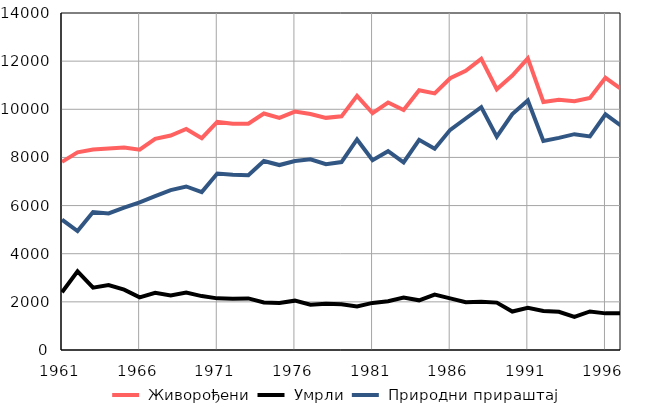
| Category |  Живорођени |  Умрли |  Природни прираштај |
|---|---|---|---|
| 1961.0 | 7814 | 2400 | 5414 |
| 1962.0 | 8210 | 3269 | 4941 |
| 1963.0 | 8325 | 2591 | 5734 |
| 1964.0 | 8373 | 2701 | 5672 |
| 1965.0 | 8415 | 2505 | 5910 |
| 1966.0 | 8323 | 2189 | 6134 |
| 1967.0 | 8773 | 2378 | 6395 |
| 1968.0 | 8910 | 2266 | 6644 |
| 1969.0 | 9180 | 2387 | 6793 |
| 1970.0 | 8798 | 2240 | 6558 |
| 1971.0 | 9475 | 2145 | 7330 |
| 1972.0 | 9403 | 2126 | 7277 |
| 1973.0 | 9403 | 2142 | 7261 |
| 1974.0 | 9825 | 1974 | 7851 |
| 1975.0 | 9639 | 1956 | 7683 |
| 1976.0 | 9902 | 2050 | 7852 |
| 1977.0 | 9804 | 1880 | 7924 |
| 1978.0 | 9644 | 1923 | 7721 |
| 1979.0 | 9707 | 1899 | 7808 |
| 1980.0 | 10556 | 1809 | 8747 |
| 1981.0 | 9844 | 1956 | 7888 |
| 1982.0 | 10281 | 2023 | 8258 |
| 1983.0 | 9970 | 2179 | 7791 |
| 1984.0 | 10792 | 2063 | 8729 |
| 1985.0 | 10660 | 2299 | 8361 |
| 1986.0 | 11289 | 2143 | 9146 |
| 1987.0 | 11601 | 1984 | 9617 |
| 1988.0 | 12096 | 2007 | 10089 |
| 1989.0 | 10833 | 1969 | 8864 |
| 1990.0 | 11399 | 1599 | 9800 |
| 1991.0 | 12118 | 1753 | 10365 |
| 1992.0 | 10304 | 1621 | 8683 |
| 1993.0 | 10396 | 1585 | 8811 |
| 1994.0 | 10338 | 1372 | 8966 |
| 1995.0 | 10474 | 1601 | 8873 |
| 1996.0 | 11309 | 1522 | 9787 |
| 1997.0 | 10848 | 1529 | 9319 |